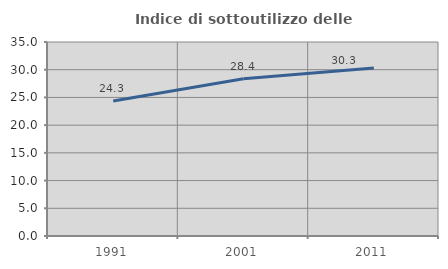
| Category | Indice di sottoutilizzo delle abitazioni  |
|---|---|
| 1991.0 | 24.35 |
| 2001.0 | 28.36 |
| 2011.0 | 30.322 |